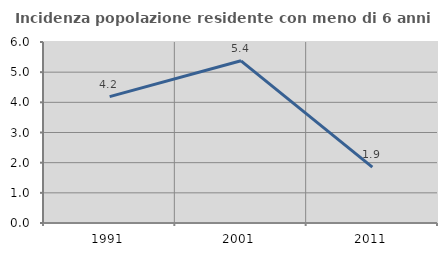
| Category | Incidenza popolazione residente con meno di 6 anni |
|---|---|
| 1991.0 | 4.188 |
| 2001.0 | 5.376 |
| 2011.0 | 1.852 |